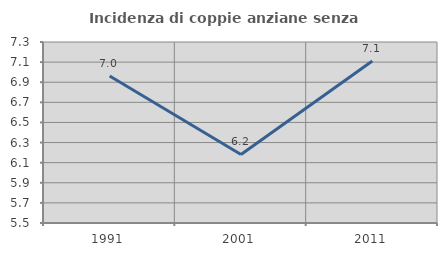
| Category | Incidenza di coppie anziane senza figli  |
|---|---|
| 1991.0 | 6.961 |
| 2001.0 | 6.182 |
| 2011.0 | 7.111 |